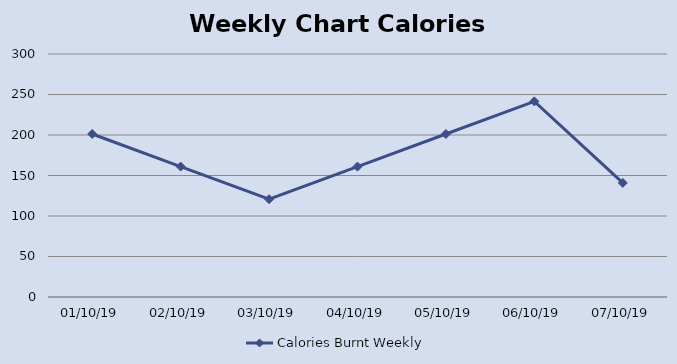
| Category | Calories Burnt Weekly |
|---|---|
| 2019-10-01 | 201.25 |
| 2019-10-02 | 161 |
| 2019-10-03 | 120.75 |
| 2019-10-04 | 161 |
| 2019-10-05 | 201.25 |
| 2019-10-06 | 241.5 |
| 2019-10-07 | 140.875 |